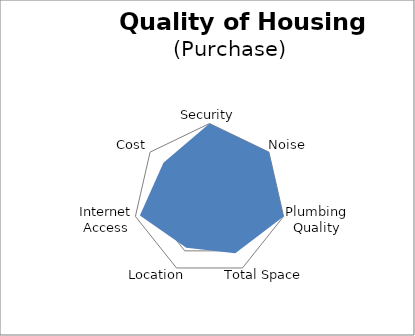
| Category | Series 0 |
|---|---|
| Security | 100 |
| Noise | 100 |
| Plumbing Quality | 100 |
| Total Space | 78.322 |
| Location | 70.469 |
| Internet Access | 93.962 |
| Cost | 77.523 |